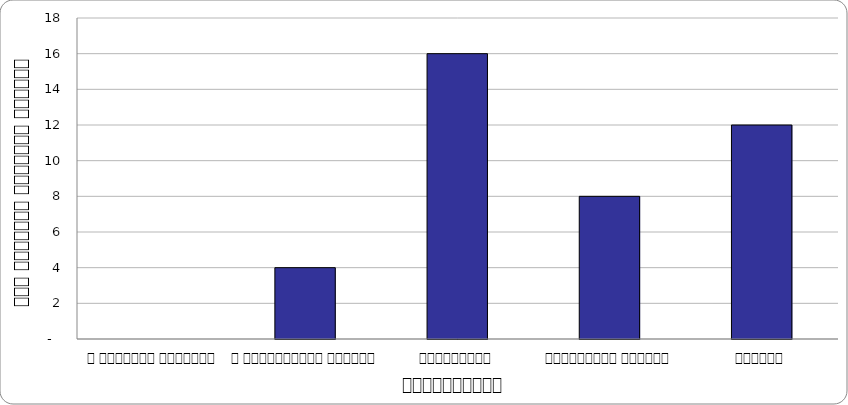
| Category | भ्रष्टाचार |
|---|---|
| द हिमालयन टाइम्स् | 0 |
| द काठमाण्डौं पोस्ट् | 4 |
| कान्तिपुर | 16 |
| अन्नपूर्ण पोस्ट् | 8 |
| नागरिक | 12 |